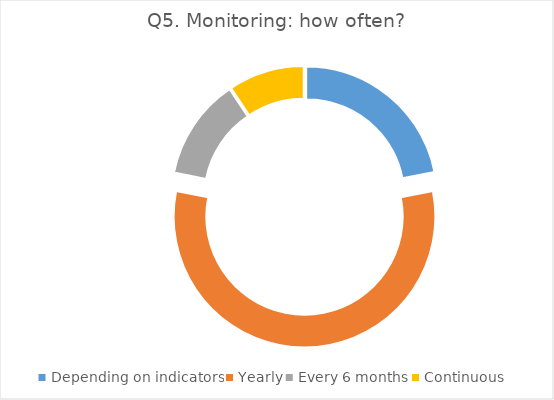
| Category | Series 0 |
|---|---|
| Depending on indicators | 7 |
| Yearly | 18 |
| Every 6 months | 4 |
| Continuous | 3 |